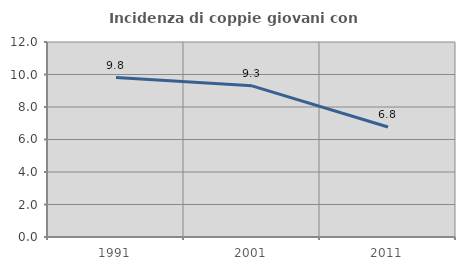
| Category | Incidenza di coppie giovani con figli |
|---|---|
| 1991.0 | 9.809 |
| 2001.0 | 9.302 |
| 2011.0 | 6.771 |